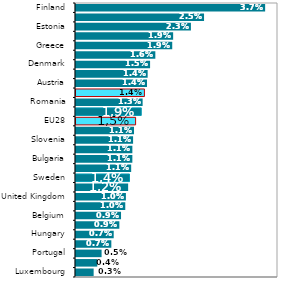
| Category | Celkem |
|---|---|
| Luxembourg | 0.003 |
| Italy | 0.004 |
| Portugal | 0.005 |
| France | 0.007 |
| Hungary | 0.007 |
| Slovakia | 0.009 |
| Belgium | 0.009 |
| Cyprus | 0.01 |
| United Kingdom | 0.01 |
| Spain | 0.01 |
| Sweden | 0.011 |
| Netherlands | 0.011 |
| Bulgaria | 0.011 |
| Lithuania | 0.011 |
| Slovenia | 0.011 |
| Malta | 0.011 |
| EU28 | 0.012 |
| Croatia | 0.013 |
| Romania | 0.013 |
| Czech Republic | 0.014 |
| Austria | 0.014 |
| Poland | 0.014 |
| Denmark | 0.015 |
| Latvia | 0.016 |
| Greece | 0.019 |
| Germany | 0.019 |
| Estonia | 0.023 |
| Ireland | 0.025 |
| Finland | 0.037 |